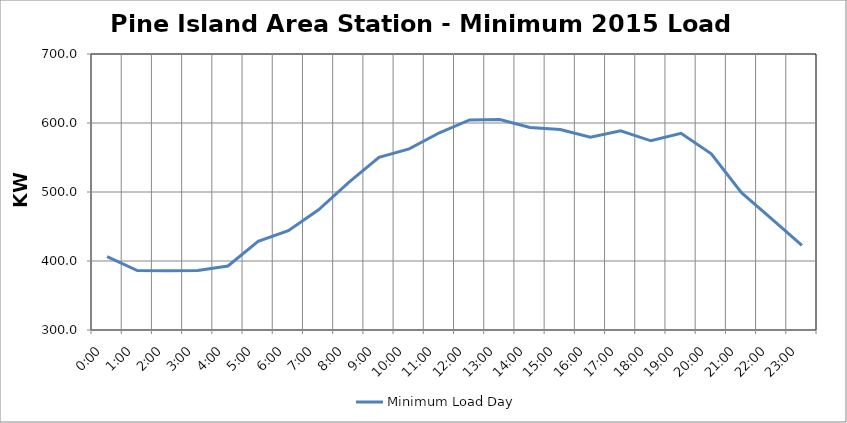
| Category | Minimum Load Day |
|---|---|
| 0.0 | 406.197 |
| 0.041666666666666664 | 386.196 |
| 0.08333333333333333 | 385.833 |
| 0.125 | 386.196 |
| 0.16666666666666666 | 392.742 |
| 0.20833333333333334 | 428.38 |
| 0.25 | 444.017 |
| 0.2916666666666667 | 474.2 |
| 0.3333333333333333 | 513.837 |
| 0.375 | 550.202 |
| 0.4166666666666667 | 562.567 |
| 0.4583333333333333 | 585.84 |
| 0.5 | 604.386 |
| 0.5416666666666666 | 605.114 |
| 0.5833333333333334 | 593.477 |
| 0.625 | 590.568 |
| 0.6666666666666666 | 579.294 |
| 0.7083333333333334 | 588.749 |
| 0.75 | 574.203 |
| 0.7916666666666666 | 585.113 |
| 0.8333333333333334 | 555.294 |
| 0.875 | 498.928 |
| 0.9166666666666666 | 461.108 |
| 0.9583333333333334 | 422.561 |